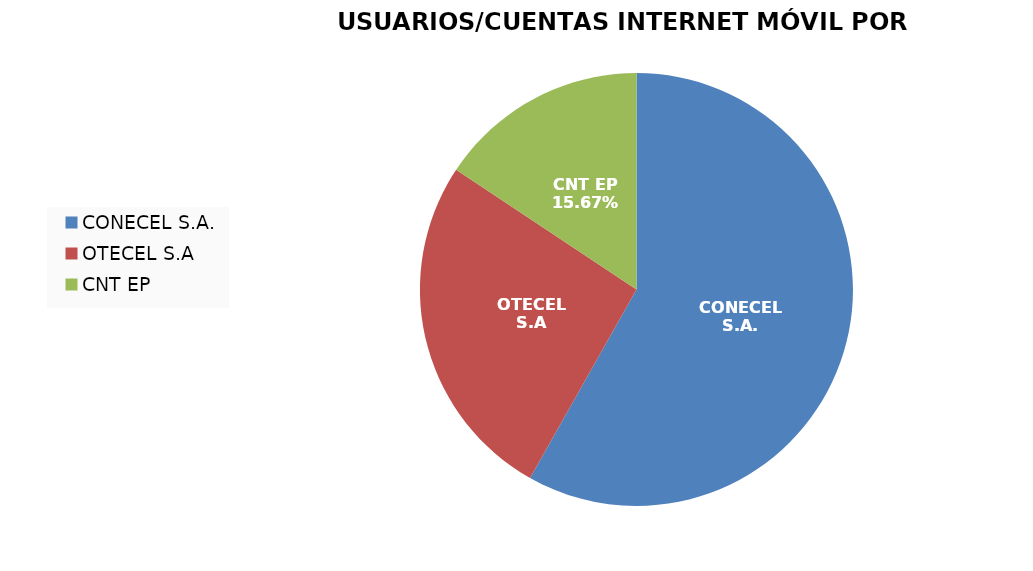
| Category | Series 0 |
|---|---|
| CONECEL S.A. | 5341485 |
| OTECEL S.A | 2400702 |
| CNT EP | 1438528 |